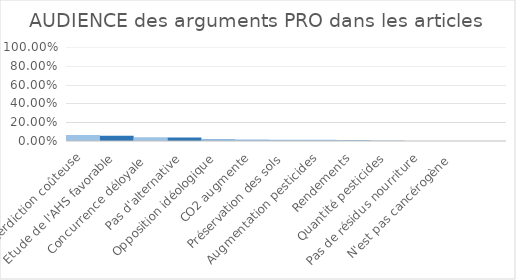
| Category | Series 0 |
|---|---|
| Interdiction coûteuse | 0.065 |
| Etude de l'AHS favorable | 0.055 |
| Concurrence déloyale  | 0.041 |
| Pas d'alternative | 0.038 |
| Opposition idéologique | 0.02 |
| CO2 augmente | 0.016 |
| Préservation des sols | 0.014 |
| Augmentation pesticides | 0.014 |
| Rendements | 0.012 |
| Quantité pesticides | 0.006 |
| Pas de résidus nourriture | 0.001 |
| N'est pas cancérogène  | 0 |